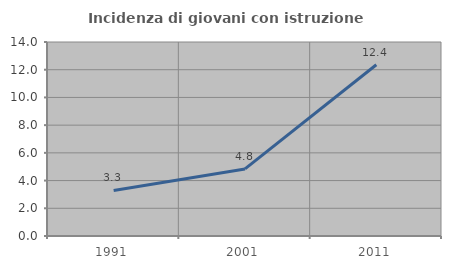
| Category | Incidenza di giovani con istruzione universitaria |
|---|---|
| 1991.0 | 3.289 |
| 2001.0 | 4.839 |
| 2011.0 | 12.36 |